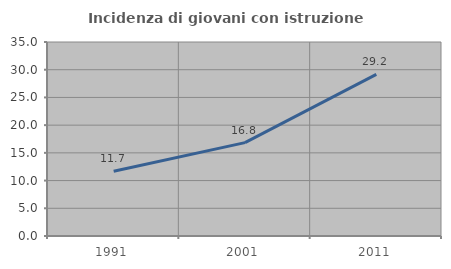
| Category | Incidenza di giovani con istruzione universitaria |
|---|---|
| 1991.0 | 11.669 |
| 2001.0 | 16.844 |
| 2011.0 | 29.168 |